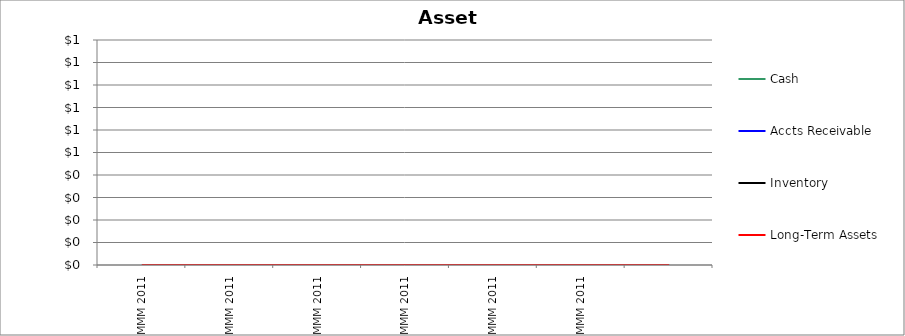
| Category | Cash | Accts Receivable | Inventory | Long-Term Assets |
|---|---|---|---|---|
| MMM 2011 | 0 | 0 | 0 | 0 |
| MMM 2011 | 0 | 0 | 0 | 0 |
| MMM 2011 | 0 | 0 | 0 | 0 |
| MMM 2011 | 0 | 0 | 0 | 0 |
| MMM 2011 | 0 | 0 | 0 | 0 |
| MMM 2011 | 0 | 0 | 0 | 0 |